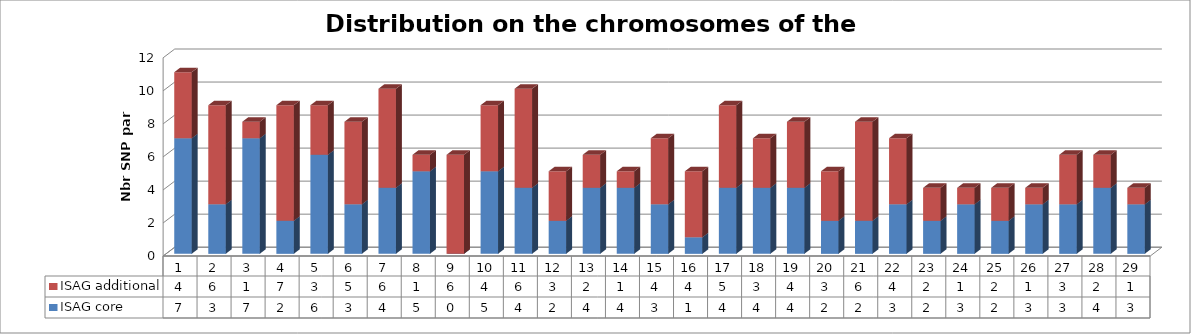
| Category | ISAG core | ISAG additional |
|---|---|---|
| 1.0 | 7 | 4 |
| 2.0 | 3 | 6 |
| 3.0 | 7 | 1 |
| 4.0 | 2 | 7 |
| 5.0 | 6 | 3 |
| 6.0 | 3 | 5 |
| 7.0 | 4 | 6 |
| 8.0 | 5 | 1 |
| 9.0 | 0 | 6 |
| 10.0 | 5 | 4 |
| 11.0 | 4 | 6 |
| 12.0 | 2 | 3 |
| 13.0 | 4 | 2 |
| 14.0 | 4 | 1 |
| 15.0 | 3 | 4 |
| 16.0 | 1 | 4 |
| 17.0 | 4 | 5 |
| 18.0 | 4 | 3 |
| 19.0 | 4 | 4 |
| 20.0 | 2 | 3 |
| 21.0 | 2 | 6 |
| 22.0 | 3 | 4 |
| 23.0 | 2 | 2 |
| 24.0 | 3 | 1 |
| 25.0 | 2 | 2 |
| 26.0 | 3 | 1 |
| 27.0 | 3 | 3 |
| 28.0 | 4 | 2 |
| 29.0 | 3 | 1 |